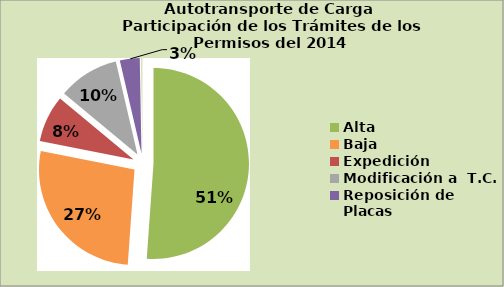
| Category | Series 0 |
|---|---|
| Alta                                         | 51.128 |
| Baja | 26.984 |
| Expedición | 7.921 |
| Modificación a  T.C. | 10.32 |
| Reposición de Placas | 3.354 |
| Otros | 0.293 |